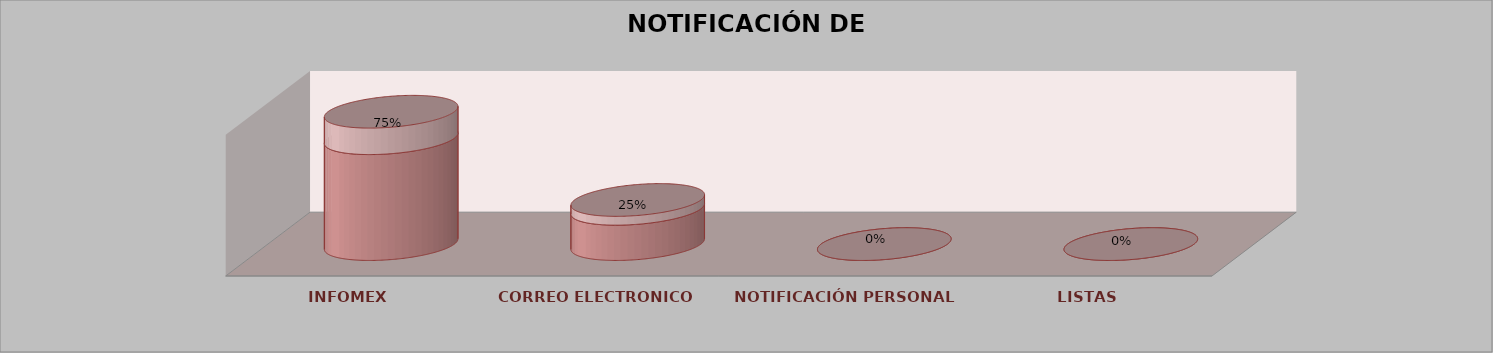
| Category | Series 0 | Series 1 | Series 2 | Series 3 | Series 4 |
|---|---|---|---|---|---|
| INFOMEX |  |  |  | 3 | 0.75 |
| CORREO ELECTRONICO |  |  |  | 1 | 0.25 |
| NOTIFICACIÓN PERSONAL |  |  |  | 0 | 0 |
| LISTAS |  |  |  | 0 | 0 |